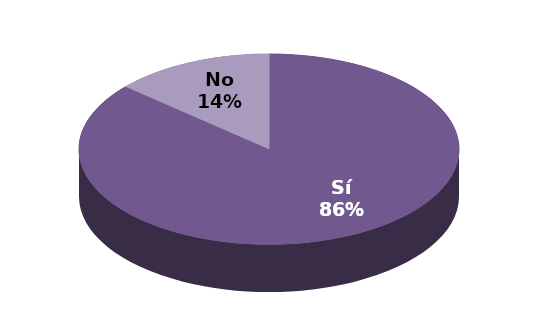
| Category | Series 1 |
|---|---|
| Sí | 19 |
| No | 3 |